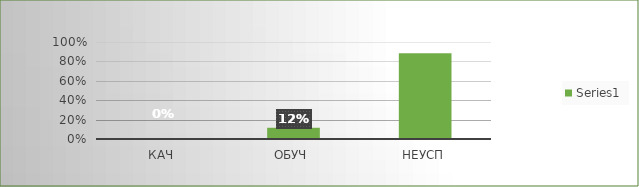
| Category | Series 0 |
|---|---|
| кач | 0 |
| обуч | 0.115 |
| неусп | 0.885 |